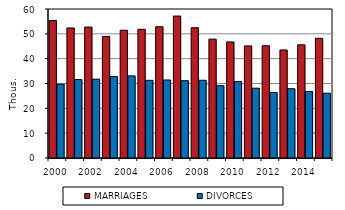
| Category | MARRIAGES | DIVORCES |
|---|---|---|
| 2000.0 | 55321 | 29704 |
| 2001.0 | 52374 | 31586 |
| 2002.0 | 52732 | 31758 |
| 2003.0 | 48943 | 32824 |
| 2004.0 | 51447 | 33060 |
| 2005.0 | 51829 | 31288 |
| 2006.0 | 52860 | 31415 |
| 2007.0 | 57157 | 31129 |
| 2008.0 | 52457 | 31300 |
| 2009.0 | 47862 | 29133 |
| 2010.0 | 46746 | 30783 |
| 2011.0 | 45137 | 28113 |
| 2012.0 | 45206 | 26402 |
| 2013.0 | 43499 | 27895 |
| 2014.0 | 45575 | 26764 |
| 2015.0 | 48191 | 26083 |